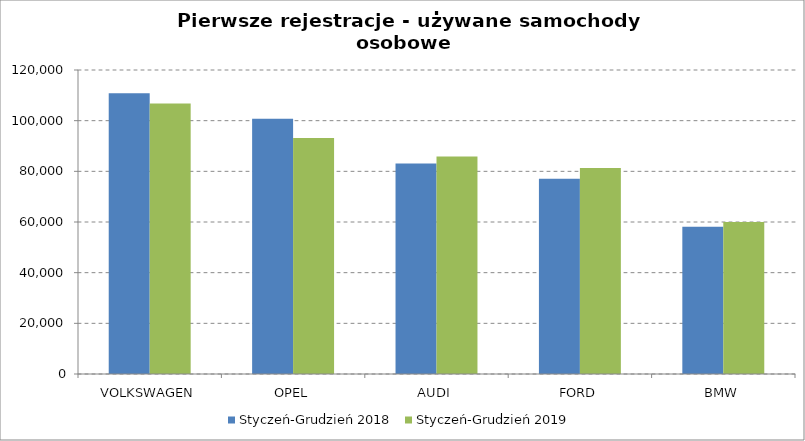
| Category | Styczeń-Grudzień 2018 | Styczeń-Grudzień 2019 |
|---|---|---|
| VOLKSWAGEN | 110777 | 106822 |
| OPEL | 100776 | 93158 |
| AUDI | 83122 | 85811 |
| FORD | 77029 | 81269 |
| BMW | 58171 | 60032 |